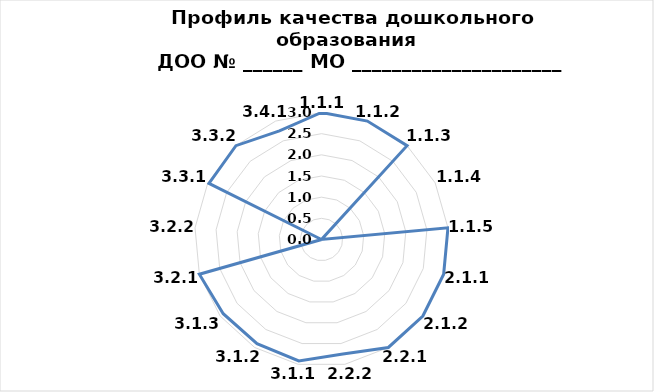
| Category | Series 0 |
|---|---|
| 1.1.1 | 3 |
| 1.1.2 | 3 |
| 1.1.3 | 3 |
| 1.1.4 | 0 |
| 1.1.5 | 3 |
| 2.1.1 | 3 |
| 2.1.2 | 3 |
| 2.2.1 | 3 |
| 2.2.2 | 2.75 |
| 3.1.1 | 2.917 |
| 3.1.2 | 2.895 |
| 3.1.3 | 2.909 |
| 3.2.1 | 3 |
| 3.2.2 | 0 |
| 3.3.1 | 2.97 |
| 3.3.2 | 3 |
| 3.4.1 | 2.75 |